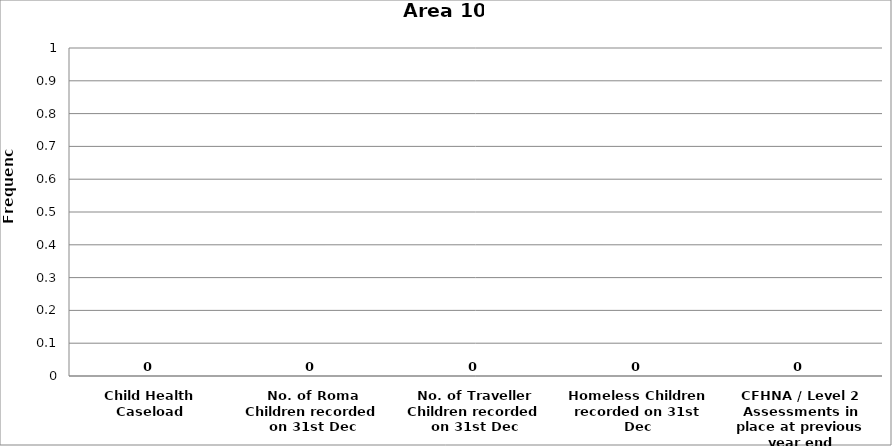
| Category | Area 10 |
|---|---|
| Child Health Caseload | 0 |
| No. of Roma Children recorded on 31st Dec | 0 |
| No. of Traveller Children recorded on 31st Dec | 0 |
| Homeless Children recorded on 31st Dec | 0 |
| CFHNA / Level 2 Assessments in place at previous year end | 0 |